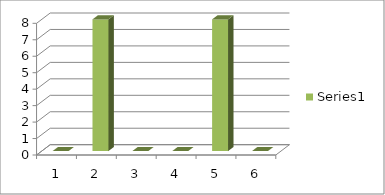
| Category | Series 0 |
|---|---|
| 0 | 0 |
| 1 | 8 |
| 2 | 0 |
| 3 | 0 |
| 4 | 8 |
| 5 | 0 |